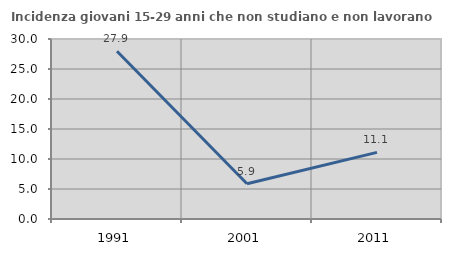
| Category | Incidenza giovani 15-29 anni che non studiano e non lavorano  |
|---|---|
| 1991.0 | 27.949 |
| 2001.0 | 5.882 |
| 2011.0 | 11.111 |